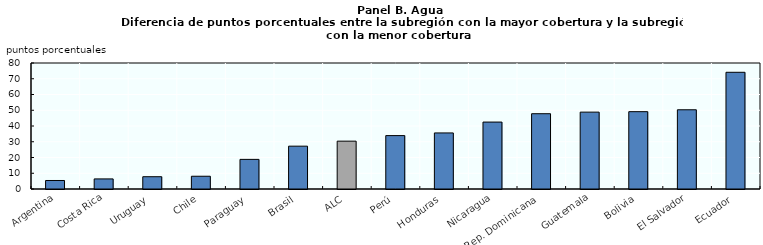
| Category | Series 0 |
|---|---|
| Argentina | 5.4 |
| Costa Rica | 6.4 |
| Uruguay | 7.8 |
| Chile | 8.1 |
| Paraguay | 18.8 |
| Brasil | 27.2 |
| ALC | 30.387 |
| Perú | 33.9 |
| Honduras | 35.6 |
| Nicaragua | 42.5 |
| Rep. Dominicana | 47.8 |
| Guatemala | 48.8 |
| Bolivia | 49.1 |
| El Salvador | 50.3 |
| Ecuador | 74.1 |